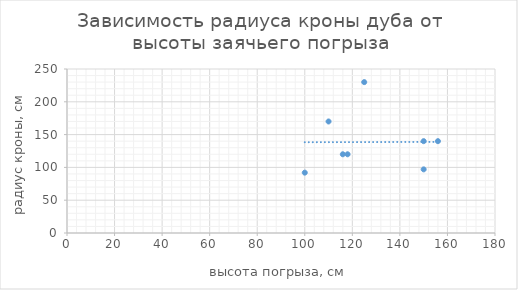
| Category | Series 0 |
|---|---|
| 156.0 | 140 |
| 118.0 | 120 |
| 150.0 | 97 |
| 100.0 | 92 |
| 150.0 | 140 |
| 116.0 | 120 |
| 110.0 | 170 |
| 125.0 | 230 |